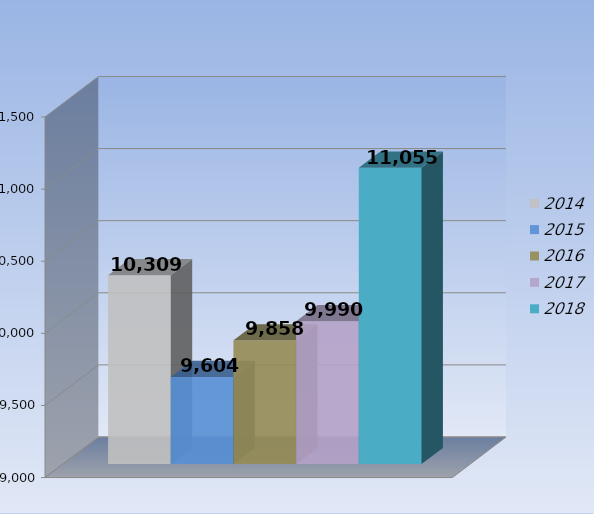
| Category | 2014 | 2015 | 2016 | 2017 | 2018 |
|---|---|---|---|---|---|
| 0 | 10309 | 9604 | 9858 | 9990 | 11055 |